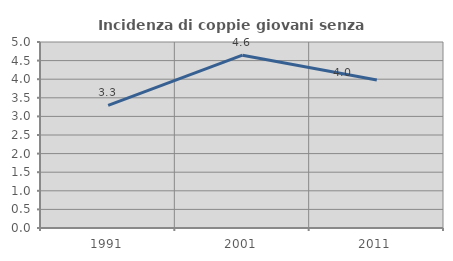
| Category | Incidenza di coppie giovani senza figli |
|---|---|
| 1991.0 | 3.297 |
| 2001.0 | 4.645 |
| 2011.0 | 3.98 |